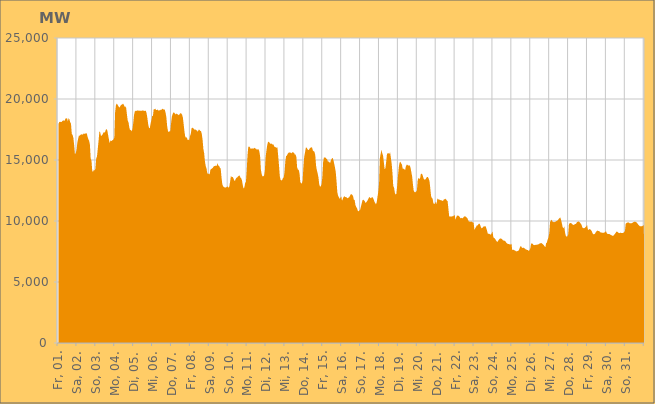
| Category | Series 0 |
|---|---|
|  Fr, 01.  | 17959.749 |
|  Fr, 01.  | 18093.89 |
|  Fr, 01.  | 18144.42 |
|  Fr, 01.  | 18116.918 |
|  Fr, 01.  | 18111.898 |
|  Fr, 01.  | 18199.907 |
|  Fr, 01.  | 18229.214 |
|  Fr, 01.  | 18240.877 |
|  Fr, 01.  | 18211.451 |
|  Fr, 01.  | 18398.891 |
|  Fr, 01.  | 18409.506 |
|  Fr, 01.  | 18418.782 |
|  Fr, 01.  | 18170.038 |
|  Fr, 01.  | 18434.551 |
|  Fr, 01.  | 18325.266 |
|  Fr, 01.  | 18093.887 |
|  Fr, 01.  | 17970.12 |
|  Sa, 02.  | 17137.213 |
|  Sa, 02.  | 17056.331 |
|  Sa, 02.  | 16801.885 |
|  Sa, 02.  | 16231.258 |
|  Sa, 02.  | 15482.666 |
|  Sa, 02.  | 15556.217 |
|  Sa, 02.  | 15824.156 |
|  Sa, 02.  | 16394.918 |
|  Sa, 02.  | 16722.75 |
|  Sa, 02.  | 16988.467 |
|  Sa, 02.  | 17001.026 |
|  Sa, 02.  | 17056.346 |
|  Sa, 02.  | 17114.056 |
|  Sa, 02.  | 17083.26 |
|  Sa, 02.  | 17083.065 |
|  Sa, 02.  | 17177.622 |
|  Sa, 02.  | 17123.808 |
|  Sa, 02.  | 17193.083 |
|  Sa, 02.  | 17139.672 |
|  Sa, 02.  | 17220.315 |
|  Sa, 02.  | 16905.036 |
|  Sa, 02.  | 16699.172 |
|  Sa, 02.  | 16570.872 |
|  Sa, 02.  | 16254.474 |
|  So, 03.  | 15112.081 |
|  So, 03.  | 14937.138 |
|  So, 03.  | 14087.31 |
|  So, 03.  | 14038.733 |
|  So, 03.  | 14209.154 |
|  So, 03.  | 14135.709 |
|  So, 03.  | 14289.874 |
|  So, 03.  | 15125.303 |
|  So, 03.  | 15301.588 |
|  So, 03.  | 15925.75 |
|  So, 03.  | 16566.077 |
|  So, 03.  | 17326.657 |
|  So, 03.  | 17271.331 |
|  So, 03.  | 16990.866 |
|  So, 03.  | 17001.891 |
|  So, 03.  | 17082.873 |
|  So, 03.  | 17223.763 |
|  So, 03.  | 17302.447 |
|  So, 03.  | 17238.458 |
|  So, 03.  | 17445.844 |
|  So, 03.  | 17545.592 |
|  So, 03.  | 17439.487 |
|  So, 03.  | 17086.323 |
|  So, 03.  | 16743.524 |
|  Mo, 04.  | 16381.39 |
|  Mo, 04.  | 16595.527 |
|  Mo, 04.  | 16556.096 |
|  Mo, 04.  | 16587.564 |
|  Mo, 04.  | 16639.394 |
|  Mo, 04.  | 16688.556 |
|  Mo, 04.  | 16848.626 |
|  Mo, 04.  | 18910.266 |
|  Mo, 04.  | 19482.327 |
|  Mo, 04.  | 19633.496 |
|  Mo, 04.  | 19538.951 |
|  Mo, 04.  | 19434.961 |
|  Mo, 04.  | 19303.748 |
|  Mo, 04.  | 19334.722 |
|  Mo, 04.  | 19462.019 |
|  Mo, 04.  | 19525.923 |
|  Mo, 04.  | 19561.501 |
|  Mo, 04.  | 19631.137 |
|  Mo, 04.  | 19531.498 |
|  Mo, 04.  | 19369.856 |
|  Mo, 04.  | 19386.792 |
|  Mo, 04.  | 19272.218 |
|  Mo, 04.  | 18727.717 |
|  Mo, 04.  | 18227.769 |
|  Di, 05.  | 18090.526 |
|  Di, 05.  | 17664.22 |
|  Di, 05.  | 17438.975 |
|  Di, 05.  | 17472.261 |
|  Di, 05.  | 17341.601 |
|  Di, 05.  | 17534.646 |
|  Di, 05.  | 18040.632 |
|  Di, 05.  | 18686.964 |
|  Di, 05.  | 18985.296 |
|  Di, 05.  | 19034.11 |
|  Di, 05.  | 19021.493 |
|  Di, 05.  | 19075.449 |
|  Di, 05.  | 19027.121 |
|  Di, 05.  | 19063.792 |
|  Di, 05.  | 19031.43 |
|  Di, 05.  | 19034.329 |
|  Di, 05.  | 19044.928 |
|  Di, 05.  | 19042.015 |
|  Di, 05.  | 19064.853 |
|  Di, 05.  | 19049.532 |
|  Di, 05.  | 19013.688 |
|  Di, 05.  | 19042.406 |
|  Di, 05.  | 19026.556 |
|  Di, 05.  | 18815.134 |
|  Mi, 06.  | 18416.063 |
|  Mi, 06.  | 17914.785 |
|  Mi, 06.  | 17636.277 |
|  Mi, 06.  | 17596.627 |
|  Mi, 06.  | 17985.358 |
|  Mi, 06.  | 18248.273 |
|  Mi, 06.  | 18589.276 |
|  Mi, 06.  | 18629.638 |
|  Mi, 06.  | 19177.144 |
|  Mi, 06.  | 19157.212 |
|  Mi, 06.  | 19202.831 |
|  Mi, 06.  | 19088.228 |
|  Mi, 06.  | 19094.448 |
|  Mi, 06.  | 19143.219 |
|  Mi, 06.  | 19044.493 |
|  Mi, 06.  | 19067.008 |
|  Mi, 06.  | 19075.881 |
|  Mi, 06.  | 19123.334 |
|  Mi, 06.  | 19123.975 |
|  Mi, 06.  | 19213.048 |
|  Mi, 06.  | 19174.287 |
|  Mi, 06.  | 19110.691 |
|  Mi, 06.  | 19148.224 |
|  Mi, 06.  | 18884.354 |
|  Do, 07.  | 18524.845 |
|  Do, 07.  | 17800.992 |
|  Do, 07.  | 17395.332 |
|  Do, 07.  | 17285.255 |
|  Do, 07.  | 17358.834 |
|  Do, 07.  | 17347.188 |
|  Do, 07.  | 18019.673 |
|  Do, 07.  | 18553.928 |
|  Do, 07.  | 18766.583 |
|  Do, 07.  | 18902.83 |
|  Do, 07.  | 18878.864 |
|  Do, 07.  | 18806.029 |
|  Do, 07.  | 18731.591 |
|  Do, 07.  | 18804.979 |
|  Do, 07.  | 18756.424 |
|  Do, 07.  | 18716.477 |
|  Do, 07.  | 18669.251 |
|  Do, 07.  | 18776.372 |
|  Do, 07.  | 18846.505 |
|  Do, 07.  | 18809.693 |
|  Do, 07.  | 18711.11 |
|  Do, 07.  | 18478.987 |
|  Do, 07.  | 17919.38 |
|  Do, 07.  | 17326.577 |
|  Fr, 08.  | 16911.395 |
|  Fr, 08.  | 16834.523 |
|  Fr, 08.  | 16858.626 |
|  Fr, 08.  | 16641.195 |
|  Fr, 08.  | 16665.975 |
|  Fr, 08.  | 16622.674 |
|  Fr, 08.  | 16963.67 |
|  Fr, 08.  | 17133.926 |
|  Fr, 08.  | 17591.102 |
|  Fr, 08.  | 17652.049 |
|  Fr, 08.  | 17605.708 |
|  Fr, 08.  | 17557.826 |
|  Fr, 08.  | 17465.064 |
|  Fr, 08.  | 17504.902 |
|  Fr, 08.  | 17440.311 |
|  Fr, 08.  | 17404.205 |
|  Fr, 08.  | 17321.266 |
|  Fr, 08.  | 17485.257 |
|  Fr, 08.  | 17480.723 |
|  Fr, 08.  | 17379.019 |
|  Fr, 08.  | 17365.349 |
|  Fr, 08.  | 17135.274 |
|  Fr, 08.  | 16657.352 |
|  Fr, 08.  | 15903.899 |
|  Sa, 09.  | 15562.131 |
|  Sa, 09.  | 14876.589 |
|  Sa, 09.  | 14508.553 |
|  Sa, 09.  | 14308.884 |
|  Sa, 09.  | 13899.607 |
|  Sa, 09.  | 13890.188 |
|  Sa, 09.  | 13845.284 |
|  Sa, 09.  | 13835.384 |
|  Sa, 09.  | 14212.279 |
|  Sa, 09.  | 14260.203 |
|  Sa, 09.  | 14319.094 |
|  Sa, 09.  | 14351.398 |
|  Sa, 09.  | 14468.432 |
|  Sa, 09.  | 14501.377 |
|  Sa, 09.  | 14527.842 |
|  Sa, 09.  | 14533.507 |
|  Sa, 09.  | 14521.441 |
|  Sa, 09.  | 14743.668 |
|  Sa, 09.  | 14530.565 |
|  Sa, 09.  | 14514.122 |
|  Sa, 09.  | 14359.661 |
|  Sa, 09.  | 14290.908 |
|  Sa, 09.  | 13580.603 |
|  Sa, 09.  | 13028.828 |
|  So, 10.  | 12837.657 |
|  So, 10.  | 12801.812 |
|  So, 10.  | 12750.876 |
|  So, 10.  | 12737.222 |
|  So, 10.  | 12766.19 |
|  So, 10.  | 12813.83 |
|  So, 10.  | 12828.233 |
|  So, 10.  | 12720.03 |
|  So, 10.  | 12853.947 |
|  So, 10.  | 13256.939 |
|  So, 10.  | 13703.293 |
|  So, 10.  | 13588.947 |
|  So, 10.  | 13615.87 |
|  So, 10.  | 13527.541 |
|  So, 10.  | 13357.844 |
|  So, 10.  | 13270.676 |
|  So, 10.  | 13445.023 |
|  So, 10.  | 13534.834 |
|  So, 10.  | 13574.356 |
|  So, 10.  | 13658.058 |
|  So, 10.  | 13702.329 |
|  So, 10.  | 13730.839 |
|  So, 10.  | 13570.675 |
|  So, 10.  | 13502.424 |
|  Mo, 11.  | 13328.916 |
|  Mo, 11.  | 12945.317 |
|  Mo, 11.  | 12660.829 |
|  Mo, 11.  | 12748.525 |
|  Mo, 11.  | 13094.488 |
|  Mo, 11.  | 13209.695 |
|  Mo, 11.  | 14092.832 |
|  Mo, 11.  | 15381.347 |
|  Mo, 11.  | 16068.516 |
|  Mo, 11.  | 16121.206 |
|  Mo, 11.  | 16041.393 |
|  Mo, 11.  | 15920.68 |
|  Mo, 11.  | 15939.663 |
|  Mo, 11.  | 15931.207 |
|  Mo, 11.  | 15945.507 |
|  Mo, 11.  | 15942.554 |
|  Mo, 11.  | 15997.719 |
|  Mo, 11.  | 15936.775 |
|  Mo, 11.  | 15917.309 |
|  Mo, 11.  | 15826.699 |
|  Mo, 11.  | 15891.734 |
|  Mo, 11.  | 15873.58 |
|  Mo, 11.  | 15719.296 |
|  Mo, 11.  | 15302.81 |
|  Di, 12.  | 14210.181 |
|  Di, 12.  | 13845.6 |
|  Di, 12.  | 13656.901 |
|  Di, 12.  | 13667.565 |
|  Di, 12.  | 13710.487 |
|  Di, 12.  | 14091.629 |
|  Di, 12.  | 15222.096 |
|  Di, 12.  | 15765.638 |
|  Di, 12.  | 16206.475 |
|  Di, 12.  | 16462.21 |
|  Di, 12.  | 16503.752 |
|  Di, 12.  | 16413.788 |
|  Di, 12.  | 16330.706 |
|  Di, 12.  | 16342.271 |
|  Di, 12.  | 16337.181 |
|  Di, 12.  | 16254.988 |
|  Di, 12.  | 16275.206 |
|  Di, 12.  | 16087.804 |
|  Di, 12.  | 16078.256 |
|  Di, 12.  | 16027.583 |
|  Di, 12.  | 16006.604 |
|  Di, 12.  | 16036.251 |
|  Di, 12.  | 15293.414 |
|  Di, 12.  | 14557.983 |
|  Mi, 13.  | 13678.577 |
|  Mi, 13.  | 13372.056 |
|  Mi, 13.  | 13315.094 |
|  Mi, 13.  | 13366.431 |
|  Mi, 13.  | 13518.025 |
|  Mi, 13.  | 13580.226 |
|  Mi, 13.  | 13995.151 |
|  Mi, 13.  | 14886.113 |
|  Mi, 13.  | 15317.301 |
|  Mi, 13.  | 15375.41 |
|  Mi, 13.  | 15505.261 |
|  Mi, 13.  | 15584.517 |
|  Mi, 13.  | 15654.269 |
|  Mi, 13.  | 15564.416 |
|  Mi, 13.  | 15628.747 |
|  Mi, 13.  | 15541.349 |
|  Mi, 13.  | 15642.187 |
|  Mi, 13.  | 15615.727 |
|  Mi, 13.  | 15600.696 |
|  Mi, 13.  | 15446.062 |
|  Mi, 13.  | 15445.529 |
|  Mi, 13.  | 15254.022 |
|  Mi, 13.  | 14405.328 |
|  Mi, 13.  | 14202.189 |
|  Do, 14.  | 14194.035 |
|  Do, 14.  | 13923.59 |
|  Do, 14.  | 13217.748 |
|  Do, 14.  | 13089.493 |
|  Do, 14.  | 13078.961 |
|  Do, 14.  | 13328.375 |
|  Do, 14.  | 14476.038 |
|  Do, 14.  | 15273.087 |
|  Do, 14.  | 15610.175 |
|  Do, 14.  | 16000.674 |
|  Do, 14.  | 16021.441 |
|  Do, 14.  | 15901.214 |
|  Do, 14.  | 15816.584 |
|  Do, 14.  | 15832.86 |
|  Do, 14.  | 15955.534 |
|  Do, 14.  | 16008.481 |
|  Do, 14.  | 16045.468 |
|  Do, 14.  | 16002.911 |
|  Do, 14.  | 15775.762 |
|  Do, 14.  | 15723.403 |
|  Do, 14.  | 15677.063 |
|  Do, 14.  | 15419.86 |
|  Do, 14.  | 14552.266 |
|  Do, 14.  | 14165.358 |
|  Fr, 15.  | 13911.31 |
|  Fr, 15.  | 13602.029 |
|  Fr, 15.  | 13026.918 |
|  Fr, 15.  | 12809.089 |
|  Fr, 15.  | 12848.786 |
|  Fr, 15.  | 13015.482 |
|  Fr, 15.  | 13614.914 |
|  Fr, 15.  | 14827.707 |
|  Fr, 15.  | 15198.885 |
|  Fr, 15.  | 15206.438 |
|  Fr, 15.  | 15208.427 |
|  Fr, 15.  | 15100.406 |
|  Fr, 15.  | 15085.641 |
|  Fr, 15.  | 14866.254 |
|  Fr, 15.  | 14885.784 |
|  Fr, 15.  | 14798.144 |
|  Fr, 15.  | 14777.663 |
|  Fr, 15.  | 14996.946 |
|  Fr, 15.  | 15107.767 |
|  Fr, 15.  | 15180.509 |
|  Fr, 15.  | 15008.628 |
|  Fr, 15.  | 14706.06 |
|  Fr, 15.  | 14391.949 |
|  Fr, 15.  | 14020.851 |
|  Sa, 16.  | 13268.818 |
|  Sa, 16.  | 12368.571 |
|  Sa, 16.  | 12073.421 |
|  Sa, 16.  | 11952.161 |
|  Sa, 16.  | 11825.331 |
|  Sa, 16.  | 11908.973 |
|  Sa, 16.  | 12024.294 |
|  Sa, 16.  | 11652.362 |
|  Sa, 16.  | 11821.557 |
|  Sa, 16.  | 11965.328 |
|  Sa, 16.  | 12039.739 |
|  Sa, 16.  | 11968.053 |
|  Sa, 16.  | 11947.605 |
|  Sa, 16.  | 11925.647 |
|  Sa, 16.  | 11853.553 |
|  Sa, 16.  | 11913.933 |
|  Sa, 16.  | 11945.213 |
|  Sa, 16.  | 12050.56 |
|  Sa, 16.  | 12188.199 |
|  Sa, 16.  | 12198.158 |
|  Sa, 16.  | 12144.707 |
|  Sa, 16.  | 12035.105 |
|  Sa, 16.  | 11744.119 |
|  Sa, 16.  | 11711.184 |
|  So, 17.  | 11309.781 |
|  So, 17.  | 11155.221 |
|  So, 17.  | 11045.473 |
|  So, 17.  | 10846.552 |
|  So, 17.  | 10790.502 |
|  So, 17.  | 10860.65 |
|  So, 17.  | 10925.923 |
|  So, 17.  | 11205.042 |
|  So, 17.  | 11441.522 |
|  So, 17.  | 11707.538 |
|  So, 17.  | 11745.143 |
|  So, 17.  | 11690.816 |
|  So, 17.  | 11602.543 |
|  So, 17.  | 11474.401 |
|  So, 17.  | 11559.148 |
|  So, 17.  | 11646.257 |
|  So, 17.  | 11776.241 |
|  So, 17.  | 11902.167 |
|  So, 17.  | 11963.414 |
|  So, 17.  | 11888.598 |
|  So, 17.  | 11852.009 |
|  So, 17.  | 11974.666 |
|  So, 17.  | 11923.248 |
|  So, 17.  | 11805.805 |
|  Mo, 18.  | 11601.011 |
|  Mo, 18.  | 11482.582 |
|  Mo, 18.  | 11372.074 |
|  Mo, 18.  | 11526.614 |
|  Mo, 18.  | 11974.807 |
|  Mo, 18.  | 12409.327 |
|  Mo, 18.  | 13072.141 |
|  Mo, 18.  | 15143.617 |
|  Mo, 18.  | 15509.139 |
|  Mo, 18.  | 15840.645 |
|  Mo, 18.  | 15562.689 |
|  Mo, 18.  | 15371.286 |
|  Mo, 18.  | 14855.695 |
|  Mo, 18.  | 14260.152 |
|  Mo, 18.  | 14314.455 |
|  Mo, 18.  | 14841.98 |
|  Mo, 18.  | 15472.27 |
|  Mo, 18.  | 15564.043 |
|  Mo, 18.  | 15560.531 |
|  Mo, 18.  | 15501.524 |
|  Mo, 18.  | 15632.588 |
|  Mo, 18.  | 15166.126 |
|  Mo, 18.  | 14683.951 |
|  Mo, 18.  | 13937.177 |
|  Di, 19.  | 12855.172 |
|  Di, 19.  | 12754.707 |
|  Di, 19.  | 12317.561 |
|  Di, 19.  | 12173.638 |
|  Di, 19.  | 12246.984 |
|  Di, 19.  | 12912.359 |
|  Di, 19.  | 13703.021 |
|  Di, 19.  | 14391.641 |
|  Di, 19.  | 14774.107 |
|  Di, 19.  | 14861.706 |
|  Di, 19.  | 14726.546 |
|  Di, 19.  | 14626.053 |
|  Di, 19.  | 14293.57 |
|  Di, 19.  | 14290.245 |
|  Di, 19.  | 14254.127 |
|  Di, 19.  | 14166.185 |
|  Di, 19.  | 14471.249 |
|  Di, 19.  | 14606.727 |
|  Di, 19.  | 14608.65 |
|  Di, 19.  | 14537.881 |
|  Di, 19.  | 14551.176 |
|  Di, 19.  | 14559.295 |
|  Di, 19.  | 14338.739 |
|  Di, 19.  | 13994.217 |
|  Mi, 20.  | 13639.408 |
|  Mi, 20.  | 12979.445 |
|  Mi, 20.  | 12464.914 |
|  Mi, 20.  | 12375.407 |
|  Mi, 20.  | 12345.246 |
|  Mi, 20.  | 12411.77 |
|  Mi, 20.  | 12508.597 |
|  Mi, 20.  | 13331.88 |
|  Mi, 20.  | 13530.266 |
|  Mi, 20.  | 13461.003 |
|  Mi, 20.  | 13478.998 |
|  Mi, 20.  | 13841.415 |
|  Mi, 20.  | 13885.426 |
|  Mi, 20.  | 13808.497 |
|  Mi, 20.  | 13592.386 |
|  Mi, 20.  | 13406.144 |
|  Mi, 20.  | 13399.787 |
|  Mi, 20.  | 13418.598 |
|  Mi, 20.  | 13549.885 |
|  Mi, 20.  | 13600.664 |
|  Mi, 20.  | 13599.362 |
|  Mi, 20.  | 13461.352 |
|  Mi, 20.  | 13274.546 |
|  Mi, 20.  | 12675.536 |
|  Do, 21.  | 12045.734 |
|  Do, 21.  | 11882.88 |
|  Do, 21.  | 11815.162 |
|  Do, 21.  | 11435.362 |
|  Do, 21.  | 11408.815 |
|  Do, 21.  | 11422.567 |
|  Do, 21.  | 11599.015 |
|  Do, 21.  | 11374.494 |
|  Do, 21.  | 11852.311 |
|  Do, 21.  | 11782.251 |
|  Do, 21.  | 11754.183 |
|  Do, 21.  | 11747.319 |
|  Do, 21.  | 11703.026 |
|  Do, 21.  | 11699.192 |
|  Do, 21.  | 11676.726 |
|  Do, 21.  | 11630.136 |
|  Do, 21.  | 11746.106 |
|  Do, 21.  | 11780.962 |
|  Do, 21.  | 11824.241 |
|  Do, 21.  | 11781.205 |
|  Do, 21.  | 11674.858 |
|  Do, 21.  | 11612.804 |
|  Do, 21.  | 11000.914 |
|  Do, 21.  | 10364.699 |
|  Fr, 22.  | 10379.311 |
|  Fr, 22.  | 10367.893 |
|  Fr, 22.  | 10365.304 |
|  Fr, 22.  | 10384.646 |
|  Fr, 22.  | 10383.851 |
|  Fr, 22.  | 10466.085 |
|  Fr, 22.  | 10487.112 |
|  Fr, 22.  | 10097.528 |
|  Fr, 22.  | 10312.277 |
|  Fr, 22.  | 10460.72 |
|  Fr, 22.  | 10422.836 |
|  Fr, 22.  | 10436.794 |
|  Fr, 22.  | 10366.039 |
|  Fr, 22.  | 10244.797 |
|  Fr, 22.  | 10217.453 |
|  Fr, 22.  | 10265.232 |
|  Fr, 22.  | 10205.295 |
|  Fr, 22.  | 10295.95 |
|  Fr, 22.  | 10385.235 |
|  Fr, 22.  | 10359.431 |
|  Fr, 22.  | 10360.397 |
|  Fr, 22.  | 10289.597 |
|  Fr, 22.  | 10244.378 |
|  Fr, 22.  | 10083.156 |
|  Sa, 23.  | 9964.837 |
|  Sa, 23.  | 9947.801 |
|  Sa, 23.  | 9944.493 |
|  Sa, 23.  | 9964.303 |
|  Sa, 23.  | 9920.025 |
|  Sa, 23.  | 9878.217 |
|  Sa, 23.  | 9851.631 |
|  Sa, 23.  | 9273.727 |
|  Sa, 23.  | 9394.866 |
|  Sa, 23.  | 9512.182 |
|  Sa, 23.  | 9622.245 |
|  Sa, 23.  | 9645.621 |
|  Sa, 23.  | 9725.387 |
|  Sa, 23.  | 9794.769 |
|  Sa, 23.  | 9721.6 |
|  Sa, 23.  | 9543.92 |
|  Sa, 23.  | 9406.333 |
|  Sa, 23.  | 9422.07 |
|  Sa, 23.  | 9512.697 |
|  Sa, 23.  | 9568.623 |
|  Sa, 23.  | 9550.414 |
|  Sa, 23.  | 9590.263 |
|  Sa, 23.  | 9429.659 |
|  Sa, 23.  | 9225.561 |
|  So, 24.  | 8961.729 |
|  So, 24.  | 8958.581 |
|  So, 24.  | 8938.195 |
|  So, 24.  | 8892.742 |
|  So, 24.  | 8895.798 |
|  So, 24.  | 9015.083 |
|  So, 24.  | 9135.984 |
|  So, 24.  | 8668.655 |
|  So, 24.  | 8597.544 |
|  So, 24.  | 8565.581 |
|  So, 24.  | 8455.08 |
|  So, 24.  | 8346.138 |
|  So, 24.  | 8275.923 |
|  So, 24.  | 8368.935 |
|  So, 24.  | 8468.573 |
|  So, 24.  | 8536.239 |
|  So, 24.  | 8569.698 |
|  So, 24.  | 8561.361 |
|  So, 24.  | 8512.045 |
|  So, 24.  | 8437.427 |
|  So, 24.  | 8393.84 |
|  So, 24.  | 8375.668 |
|  So, 24.  | 8368.853 |
|  So, 24.  | 8266.069 |
|  Mo, 25.  | 8179.513 |
|  Mo, 25.  | 8133.922 |
|  Mo, 25.  | 8115.223 |
|  Mo, 25.  | 8108.656 |
|  Mo, 25.  | 8067.968 |
|  Mo, 25.  | 8080.862 |
|  Mo, 25.  | 8149.539 |
|  Mo, 25.  | 7607.307 |
|  Mo, 25.  | 7644.836 |
|  Mo, 25.  | 7631.557 |
|  Mo, 25.  | 7589.403 |
|  Mo, 25.  | 7566.341 |
|  Mo, 25.  | 7509.106 |
|  Mo, 25.  | 7512.535 |
|  Mo, 25.  | 7549.803 |
|  Mo, 25.  | 7557.022 |
|  Mo, 25.  | 7706.511 |
|  Mo, 25.  | 7873.198 |
|  Mo, 25.  | 7958.386 |
|  Mo, 25.  | 7847.429 |
|  Mo, 25.  | 7776.774 |
|  Mo, 25.  | 7824.5 |
|  Mo, 25.  | 7774.709 |
|  Mo, 25.  | 7752.827 |
|  Di, 26.  | 7682.583 |
|  Di, 26.  | 7653.611 |
|  Di, 26.  | 7623.948 |
|  Di, 26.  | 7610.824 |
|  Di, 26.  | 7538.604 |
|  Di, 26.  | 7611.195 |
|  Di, 26.  | 7785.867 |
|  Di, 26.  | 8142.298 |
|  Di, 26.  | 8158.504 |
|  Di, 26.  | 8122.068 |
|  Di, 26.  | 8046.84 |
|  Di, 26.  | 8018.769 |
|  Di, 26.  | 8027.718 |
|  Di, 26.  | 8059.966 |
|  Di, 26.  | 8050.242 |
|  Di, 26.  | 8070.697 |
|  Di, 26.  | 8082.148 |
|  Di, 26.  | 8117.261 |
|  Di, 26.  | 8172.644 |
|  Di, 26.  | 8176.327 |
|  Di, 26.  | 8192.365 |
|  Di, 26.  | 8136.98 |
|  Di, 26.  | 8098.495 |
|  Di, 26.  | 8022.362 |
|  Mi, 27.  | 7935.301 |
|  Mi, 27.  | 7843.818 |
|  Mi, 27.  | 8173.44 |
|  Mi, 27.  | 8247.875 |
|  Mi, 27.  | 8490.371 |
|  Mi, 27.  | 8654.103 |
|  Mi, 27.  | 8997.933 |
|  Mi, 27.  | 9900.866 |
|  Mi, 27.  | 10030.815 |
|  Mi, 27.  | 10111.216 |
|  Mi, 27.  | 9956.018 |
|  Mi, 27.  | 9931.702 |
|  Mi, 27.  | 9901.756 |
|  Mi, 27.  | 9933.134 |
|  Mi, 27.  | 9946.271 |
|  Mi, 27.  | 9997.35 |
|  Mi, 27.  | 10026.136 |
|  Mi, 27.  | 10080.044 |
|  Mi, 27.  | 10165.132 |
|  Mi, 27.  | 10241.4 |
|  Mi, 27.  | 10290.981 |
|  Mi, 27.  | 10082.294 |
|  Mi, 27.  | 9805.266 |
|  Mi, 27.  | 9503.452 |
|  Do, 28.  | 9387.019 |
|  Do, 28.  | 9564.96 |
|  Do, 28.  | 9073.193 |
|  Do, 28.  | 8780.978 |
|  Do, 28.  | 8722.351 |
|  Do, 28.  | 8744.47 |
|  Do, 28.  | 8895.889 |
|  Do, 28.  | 9758.653 |
|  Do, 28.  | 9811.909 |
|  Do, 28.  | 9832.808 |
|  Do, 28.  | 9823.123 |
|  Do, 28.  | 9760.999 |
|  Do, 28.  | 9688.356 |
|  Do, 28.  | 9674.62 |
|  Do, 28.  | 9722.585 |
|  Do, 28.  | 9749.518 |
|  Do, 28.  | 9774.369 |
|  Do, 28.  | 9899.456 |
|  Do, 28.  | 9941.513 |
|  Do, 28.  | 9954.835 |
|  Do, 28.  | 9936.125 |
|  Do, 28.  | 9860.814 |
|  Do, 28.  | 9786.911 |
|  Do, 28.  | 9680.71 |
|  Fr, 29.  | 9469.013 |
|  Fr, 29.  | 9423.684 |
|  Fr, 29.  | 9405.076 |
|  Fr, 29.  | 9438.978 |
|  Fr, 29.  | 9495.855 |
|  Fr, 29.  | 9562.801 |
|  Fr, 29.  | 9663.796 |
|  Fr, 29.  | 9329.612 |
|  Fr, 29.  | 9265.106 |
|  Fr, 29.  | 9341.46 |
|  Fr, 29.  | 9312.556 |
|  Fr, 29.  | 9251.036 |
|  Fr, 29.  | 9151.744 |
|  Fr, 29.  | 8988.117 |
|  Fr, 29.  | 8905.214 |
|  Fr, 29.  | 8924.751 |
|  Fr, 29.  | 8954.369 |
|  Fr, 29.  | 9076.982 |
|  Fr, 29.  | 9157.499 |
|  Fr, 29.  | 9215.161 |
|  Fr, 29.  | 9189.964 |
|  Fr, 29.  | 9184.163 |
|  Fr, 29.  | 9129.061 |
|  Fr, 29.  | 9060.407 |
|  Sa, 30.  | 9060.255 |
|  Sa, 30.  | 9031.345 |
|  Sa, 30.  | 9033.605 |
|  Sa, 30.  | 9043.961 |
|  Sa, 30.  | 9050.592 |
|  Sa, 30.  | 9097.009 |
|  Sa, 30.  | 9160.823 |
|  Sa, 30.  | 8993.235 |
|  Sa, 30.  | 8942.472 |
|  Sa, 30.  | 8938.883 |
|  Sa, 30.  | 8935.295 |
|  Sa, 30.  | 8911.774 |
|  Sa, 30.  | 8859.394 |
|  Sa, 30.  | 8833.568 |
|  Sa, 30.  | 8801.334 |
|  Sa, 30.  | 8758.043 |
|  Sa, 30.  | 8859.543 |
|  Sa, 30.  | 8921.194 |
|  Sa, 30.  | 8997.48 |
|  Sa, 30.  | 9109.97 |
|  Sa, 30.  | 9134.073 |
|  Sa, 30.  | 9079.522 |
|  Sa, 30.  | 9031.91 |
|  Sa, 30.  | 8996.516 |
|  So, 31.  | 9029.585 |
|  So, 31.  | 9026.227 |
|  So, 31.  | 9010.457 |
|  So, 31.  | 9021.383 |
|  So, 31.  | 9027.329 |
|  So, 31.  | 9107.976 |
|  So, 31.  | 9152.289 |
|  So, 31.  | 9782.579 |
|  So, 31.  | 9830.537 |
|  So, 31.  | 9868.083 |
|  So, 31.  | 9876.616 |
|  So, 31.  | 9886.424 |
|  So, 31.  | 9816.814 |
|  So, 31.  | 9821.242 |
|  So, 31.  | 9804.904 |
|  So, 31.  | 9832.976 |
|  So, 31.  | 9864.364 |
|  So, 31.  | 9918.9 |
|  So, 31.  | 9941.897 |
|  So, 31.  | 9941.487 |
|  So, 31.  | 9911.197 |
|  So, 31.  | 9868.214 |
|  So, 31.  | 9789.749 |
|  So, 31.  | 9701.239 |
|  Mo, 01.  | 9623.392 |
|  Mo, 01.  | 9573.553 |
|  Mo, 01.  | 9565.631 |
|  Mo, 01.  | 9568.058 |
|  Mo, 01.  | 9577.657 |
|  Mo, 01.  | 9626.868 |
|    | 9666.529 |